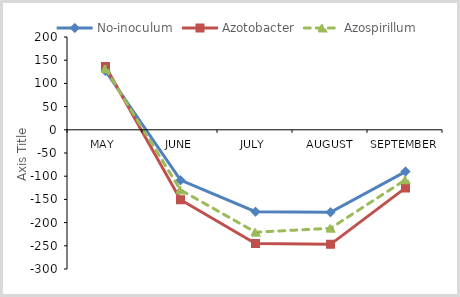
| Category | No-inoculum | Azotobacter | Azospirillum |
|---|---|---|---|
| May | 126.94 | 136.5 | 131.72 |
| June | -108.48 | -150.667 | -129.573 |
| July | -176.4 | -245 | -220.7 |
| August | -177.72 | -246.833 | -212.277 |
| September | -90.12 | -125.167 | -107.643 |